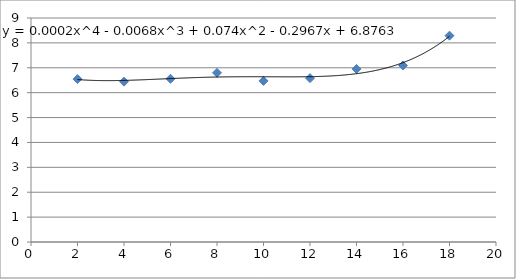
| Category | Series 0 |
|---|---|
| 18.0 | 8.289 |
| 16.0 | 7.093 |
| 14.0 | 6.953 |
| 12.0 | 6.583 |
| 10.0 | 6.473 |
| 8.0 | 6.798 |
| 6.0 | 6.557 |
| 4.0 | 6.443 |
| 2.0 | 6.545 |